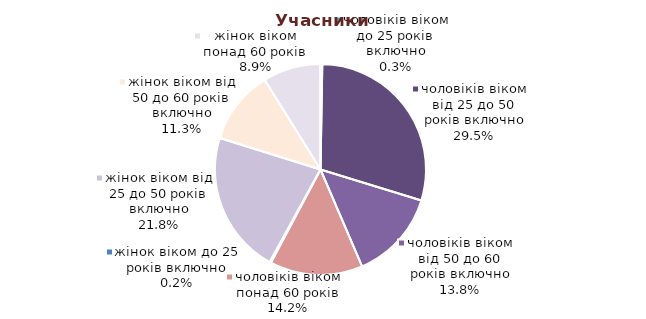
| Category | Series 0 |
|---|---|
| жінок віком до 25 років включно | 1793 |
| жінок віком від 25 до 50 років включно | 191292 |
| жінок віком від 50 до 60 років включно | 99107 |
| жінок віком понад 60 років | 77483 |
| чоловіків віком до 25 років включно | 2555 |
| чоловіків віком від 25 до 50 років включно | 258125 |
| чоловіків віком від 50 до 60 років включно | 120918 |
| чоловіків віком понад 60 років | 124665 |